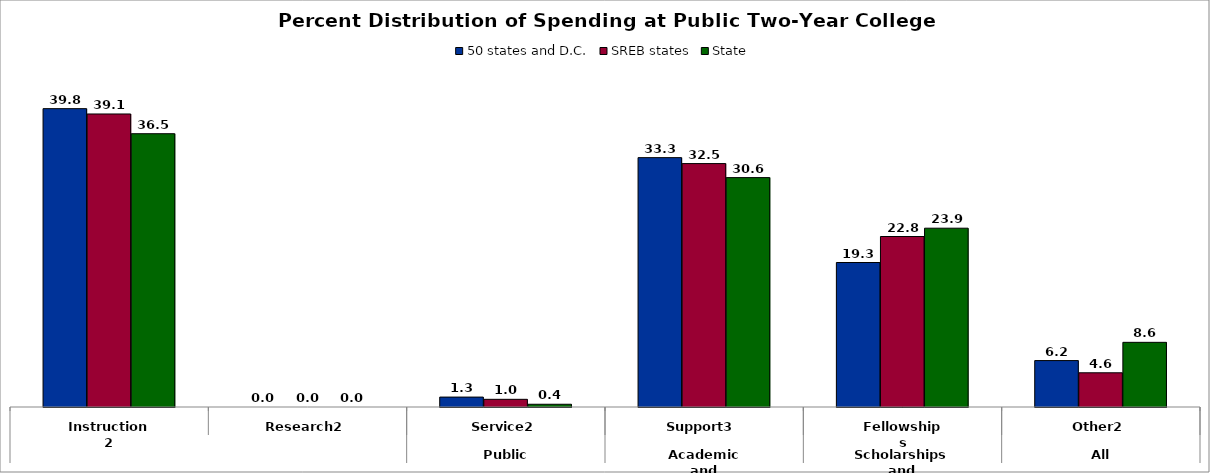
| Category | 50 states and D.C. | SREB states | State |
|---|---|---|---|
| 0 | 39.839 | 39.128 | 36.492 |
| 1 | 0 | 0 | 0 |
| 2 | 1.323 | 1.025 | 0.366 |
| 3 | 33.298 | 32.504 | 30.63 |
| 4 | 19.294 | 22.766 | 23.877 |
| 5 | 6.198 | 4.569 | 8.635 |